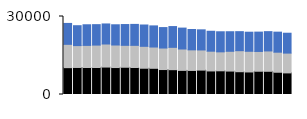
| Category | Item1 Online | Item1 Store | Item1 Phone |
|---|---|---|---|
| 0 | 10325 | 8968 | 8044 |
| 1 | 10398 | 8413 | 7650 |
| 2 | 10380 | 8505 | 7935 |
| 3 | 10383 | 8620 | 7863 |
| 4 | 10553 | 8867 | 7714 |
| 5 | 10368 | 8668 | 7783 |
| 6 | 10481 | 8431 | 7996 |
| 7 | 10378 | 8525 | 8058 |
| 8 | 10104 | 8423 | 8206 |
| 9 | 10077 | 8182 | 8129 |
| 10 | 9599 | 8275 | 7866 |
| 11 | 9548 | 8587 | 7994 |
| 12 | 9276 | 8225 | 8040 |
| 13 | 9254 | 7920 | 7824 |
| 14 | 9380 | 7750 | 7742 |
| 15 | 9061 | 7594 | 7667 |
| 16 | 9116 | 7291 | 7721 |
| 17 | 9015 | 7604 | 7524 |
| 18 | 8768 | 8083 | 7319 |
| 19 | 8670 | 7951 | 7336 |
| 20 | 8946 | 7611 | 7438 |
| 21 | 8930 | 7817 | 7429 |
| 22 | 8558 | 7716 | 7706 |
| 23 | 8312 | 7609 | 7646 |